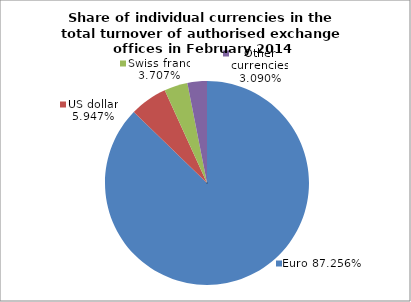
| Category | EUR |
|---|---|
| 0 | 0.873 |
| 1 | 0.059 |
| 2 | 0.037 |
| 3 | 0.031 |